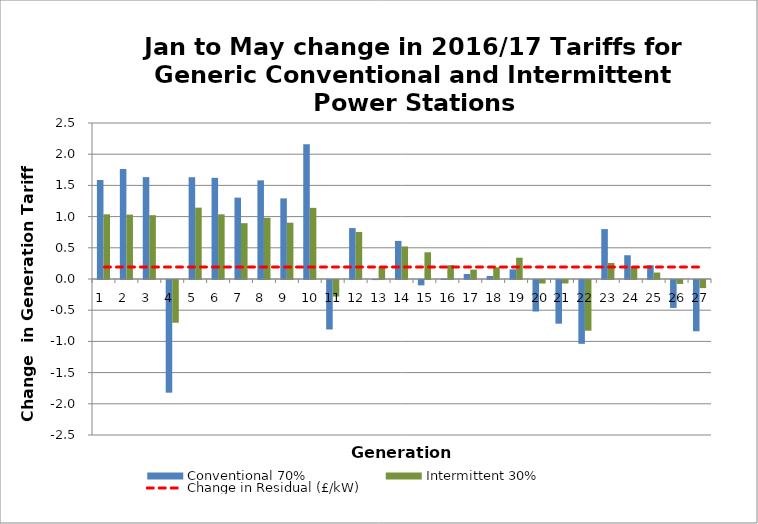
| Category | Conventional 70% | Intermittent 30% |
|---|---|---|
| 1.0 | 1.587 | 1.037 |
| 2.0 | 1.764 | 1.032 |
| 3.0 | 1.633 | 1.023 |
| 4.0 | -1.806 | -0.685 |
| 5.0 | 1.631 | 1.144 |
| 6.0 | 1.621 | 1.037 |
| 7.0 | 1.304 | 0.895 |
| 8.0 | 1.581 | 0.981 |
| 9.0 | 1.292 | 0.902 |
| 10.0 | 2.161 | 1.14 |
| 11.0 | -0.793 | -0.265 |
| 12.0 | 0.816 | 0.753 |
| 13.0 | -0.002 | 0.196 |
| 14.0 | 0.611 | 0.522 |
| 15.0 | -0.086 | 0.429 |
| 16.0 | 0.007 | 0.221 |
| 17.0 | 0.08 | 0.151 |
| 18.0 | 0.048 | 0.188 |
| 19.0 | 0.155 | 0.342 |
| 20.0 | -0.505 | -0.056 |
| 21.0 | -0.7 | -0.056 |
| 22.0 | -1.023 | -0.813 |
| 23.0 | 0.8 | 0.257 |
| 24.0 | 0.381 | 0.187 |
| 25.0 | 0.22 | 0.104 |
| 26.0 | -0.448 | -0.063 |
| 27.0 | -0.822 | -0.13 |